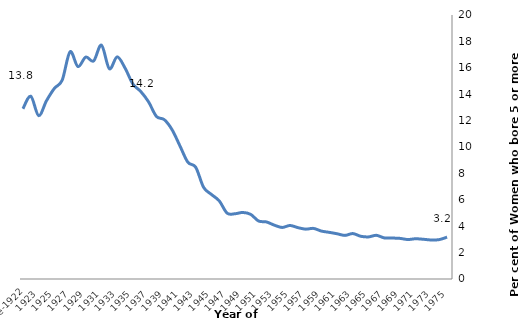
| Category | Series 0 |
|---|---|
| 1975 | 3.172 |
| 1974 | 2.983 |
| 1973 | 2.956 |
| 1972 | 3.008 |
| 1971 | 3.049 |
| 1970 | 2.991 |
| 1969 | 3.077 |
| 1968 | 3.102 |
| 1967 | 3.115 |
| 1966 | 3.308 |
| 1965 | 3.19 |
| 1964 | 3.239 |
| 1963 | 3.442 |
| 1962 | 3.303 |
| 1961 | 3.426 |
| 1960 | 3.534 |
| 1959 | 3.63 |
| 1958 | 3.833 |
| 1957 | 3.777 |
| 1956 | 3.893 |
| 1955 | 4.054 |
| 1954 | 3.904 |
| 1953 | 4.081 |
| 1952 | 4.324 |
| 1951 | 4.393 |
| 1950 | 4.895 |
| 1949 | 5.04 |
| 1948 | 4.943 |
| 1947 | 4.986 |
| 1946 | 5.915 |
| 1945 | 6.404 |
| 1944 | 6.947 |
| 1943 | 8.464 |
| 1942 | 8.846 |
| 1941 | 10.071 |
| 1940 | 11.297 |
| 1939 | 12.069 |
| 1938 | 12.316 |
| 1937 | 13.415 |
| 1936 | 14.206 |
| 1935 | 14.774 |
| 1934 | 15.98 |
| 1933 | 16.828 |
| 1932 | 15.931 |
| 1931 | 17.715 |
| 1930 | 16.521 |
| 1929 | 16.813 |
| 1928 | 16.093 |
| 1927 | 17.214 |
| 1926 | 15.065 |
| 1925 | 14.438 |
| 1924 | 13.505 |
| 1923 | 12.377 |
| 1922 | 13.846 |
| Pre-1922 | 12.896 |